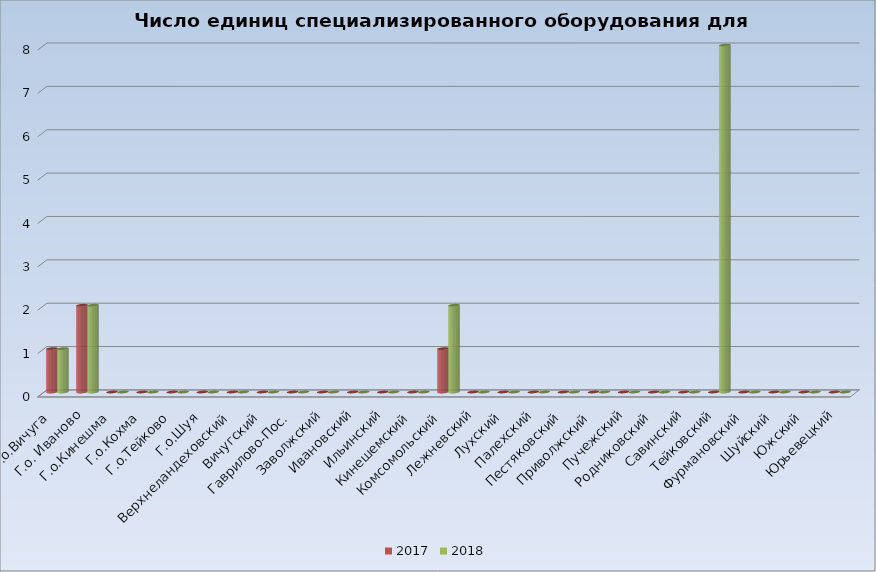
| Category | 2017 | 2018 |
|---|---|---|
| Г.о.Вичуга | 1 | 1 |
| Г.о. Иваново | 2 | 2 |
| Г.о.Кинешма | 0 | 0 |
| Г.о.Кохма | 0 | 0 |
| Г.о.Тейково | 0 | 0 |
| Г.о.Шуя | 0 | 0 |
| Верхнеландеховский | 0 | 0 |
| Вичугский | 0 | 0 |
| Гаврилово-Пос. | 0 | 0 |
| Заволжский | 0 | 0 |
| Ивановский | 0 | 0 |
| Ильинский | 0 | 0 |
| Кинешемский | 0 | 0 |
| Комсомольский | 1 | 2 |
| Лежневский | 0 | 0 |
| Лухский | 0 | 0 |
| Палехский | 0 | 0 |
| Пестяковский | 0 | 0 |
| Приволжский | 0 | 0 |
| Пучежский | 0 | 0 |
| Родниковский | 0 | 0 |
| Савинский | 0 | 0 |
| Тейковский | 0 | 8 |
| Фурмановский | 0 | 0 |
| Шуйский | 0 | 0 |
| Южский | 0 | 0 |
| Юрьевецкий | 0 | 0 |